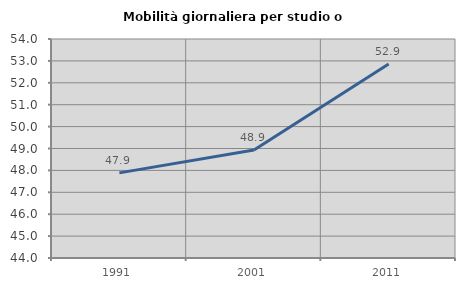
| Category | Mobilità giornaliera per studio o lavoro |
|---|---|
| 1991.0 | 47.887 |
| 2001.0 | 48.932 |
| 2011.0 | 52.863 |